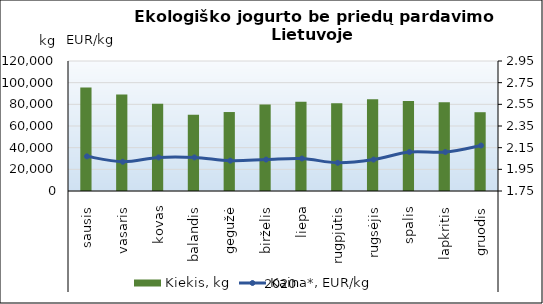
| Category | Kiekis, kg |
|---|---|
| 0 | 95560 |
| 1 | 89107 |
| 2 | 80497 |
| 3 | 70388 |
| 4 | 72893 |
| 5 | 79846 |
| 6 | 82282 |
| 7 | 81040 |
| 8 | 84795 |
| 9 | 82965 |
| 10 | 81892 |
| 11 | 72733 |